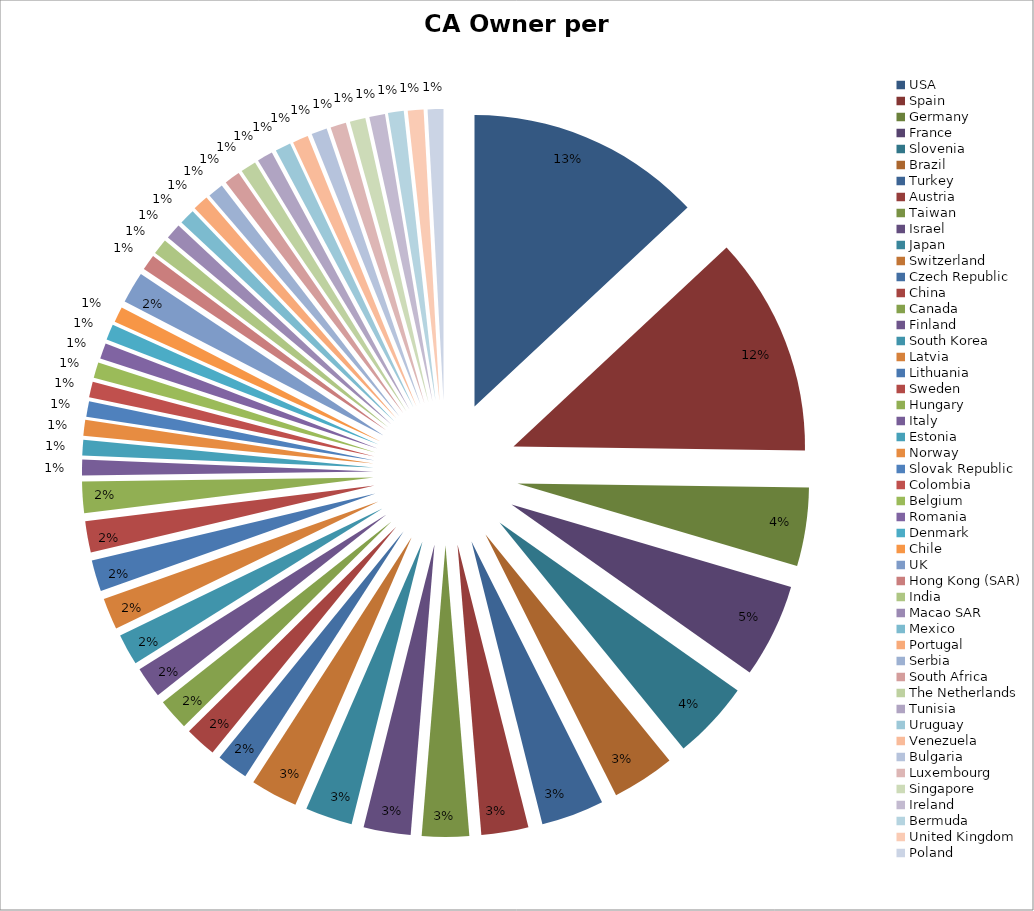
| Category | Count |
|---|---|
| USA | 15 |
| Spain | 14 |
| Germany | 5 |
| France | 6 |
| Slovenia | 5 |
| Brazil | 4 |
| Turkey | 4 |
| Austria | 3 |
| Taiwan | 3 |
| Israel | 3 |
| Japan | 3 |
| Switzerland | 3 |
| Czech Republic | 2 |
| China | 2 |
| Canada | 2 |
| Finland | 2 |
| South Korea | 2 |
| Latvia | 2 |
| Lithuania | 2 |
| Sweden | 2 |
| Hungary | 2 |
| Italy | 1 |
| Estonia | 1 |
| Norway | 1 |
| Slovak Republic | 1 |
| Colombia | 1 |
| Belgium | 1 |
| Romania | 1 |
| Denmark | 1 |
| Chile | 1 |
| UK | 2 |
| Hong Kong (SAR) | 1 |
| India | 1 |
| Macao SAR | 1 |
| Mexico | 1 |
| Portugal | 1 |
| Serbia | 1 |
| South Africa | 1 |
| The Netherlands | 1 |
| Tunisia | 1 |
| Uruguay | 1 |
| Venezuela | 1 |
| Bulgaria | 1 |
| Luxembourg | 1 |
| Singapore | 1 |
| Ireland | 1 |
| Bermuda | 1 |
| United Kingdom | 1 |
| Poland | 1 |